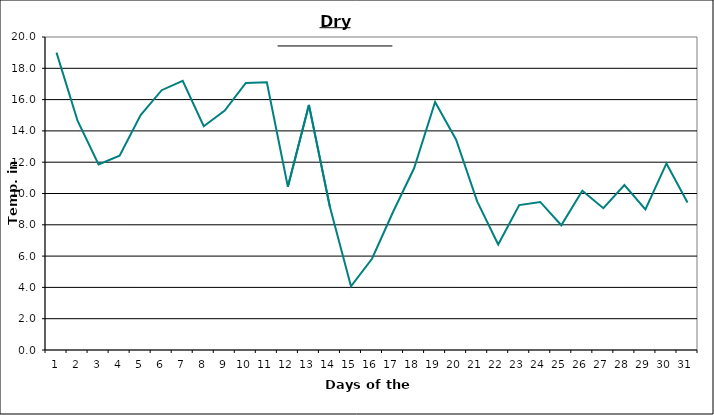
| Category | Series 0 |
|---|---|
| 0 | 19 |
| 1 | 14.65 |
| 2 | 11.86 |
| 3 | 12.42 |
| 4 | 15.01 |
| 5 | 16.6 |
| 6 | 17.2 |
| 7 | 14.3 |
| 8 | 15.3 |
| 9 | 17.06 |
| 10 | 17.11 |
| 11 | 10.43 |
| 12 | 15.66 |
| 13 | 9.13 |
| 14 | 4.07 |
| 15 | 5.83 |
| 16 | 8.82 |
| 17 | 11.61 |
| 18 | 15.85 |
| 19 | 13.44 |
| 20 | 9.5 |
| 21 | 6.74 |
| 22 | 9.26 |
| 23 | 9.46 |
| 24 | 7.97 |
| 25 | 10.17 |
| 26 | 9.06 |
| 27 | 10.54 |
| 28 | 8.99 |
| 29 | 11.92 |
| 30 | 9.43 |